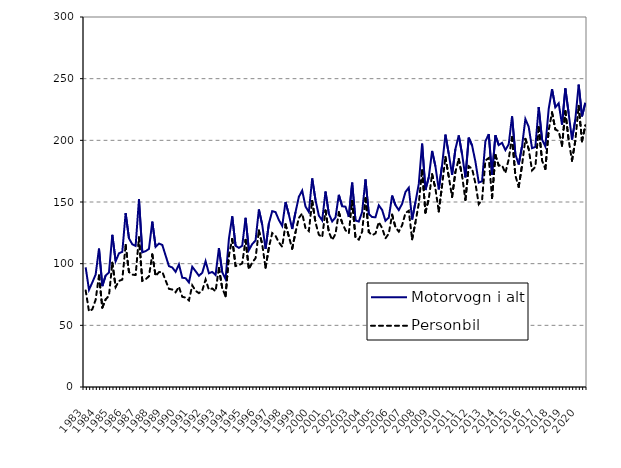
| Category | Motorvogn i alt | Personbil |
|---|---|---|
| 1983.0 | 97 | 78.3 |
| nan | 78.8 | 61.3 |
| nan | 84.8 | 63 |
| nan | 91.2 | 70.8 |
| 1984.0 | 112.2 | 90.4 |
| nan | 81.8 | 64.4 |
| nan | 90.4 | 71.1 |
| nan | 92.9 | 73.9 |
| 1985.0 | 123.4 | 100.8 |
| nan | 102 | 81.1 |
| nan | 108.4 | 86 |
| nan | 109.6 | 87.1 |
| 1986.0 | 141 | 115.2 |
| nan | 120.5 | 93.2 |
| nan | 115.7 | 91.1 |
| nan | 114.4 | 90.8 |
| 1987.0 | 152.2 | 121.3 |
| nan | 109.2 | 86.1 |
| nan | 110.1 | 87.3 |
| nan | 112 | 89.8 |
| 1988.0 | 134.1 | 107.5 |
| nan | 113.7 | 90 |
| nan | 116.3 | 93.1 |
| nan | 115.2 | 93.4 |
| 1989.0 | 106.6 | 86.4 |
| nan | 98 | 79.6 |
| nan | 96.9 | 79 |
| nan | 93.4 | 76.8 |
| 1990.0 | 99.4 | 81.3 |
| nan | 88.6 | 73.1 |
| nan | 88.2 | 72.5 |
| nan | 84.8 | 70.2 |
| 1991.0 | 97.5 | 82.4 |
| nan | 93.9 | 78 |
| nan | 90.2 | 76.1 |
| nan | 92.6 | 78.1 |
| 1992.0 | 102 | 87.1 |
| nan | 92.2 | 78.9 |
| nan | 93.3 | 79.9 |
| nan | 90.8 | 77.6 |
| 1993.0 | 112.6 | 96.5 |
| nan | 93 | 80.1 |
| nan | 87.5 | 73.6 |
| nan | 120.1 | 106.6 |
| 1994.0 | 138.4 | 120 |
| nan | 114.5 | 98.1 |
| nan | 112.8 | 98.8 |
| nan | 114.5 | 100.2 |
| 1995.0 | 137.2 | 119.3 |
| nan | 111 | 95.4 |
| nan | 115.9 | 101 |
| nan | 118.8 | 104.4 |
| 1996.0 | 143.9 | 126.9 |
| nan | 131.6 | 115.7 |
| nan | 112 | 96.7 |
| nan | 132.5 | 113.1 |
| 1997.0 | 142.6 | 124.8 |
| nan | 141.8 | 122.5 |
| nan | 135.4 | 117.3 |
| nan | 130.6 | 113.7 |
| 1998.0 | 150 | 131.9 |
| nan | 139.8 | 122 |
| nan | 128.1 | 112.1 |
| nan | 141.8 | 125.6 |
| 1999.0 | 154.2 | 137.1 |
| nan | 159.3 | 140.7 |
| nan | 146.3 | 128.7 |
| nan | 141.9 | 126.4 |
| 2000.0 | 169.1 | 150.9 |
| nan | 151.5 | 133.4 |
| nan | 139 | 123.5 |
| nan | 135.1 | 121.4 |
| 2001.0 | 158.5 | 143.1 |
| nan | 140.46 | 125.7 |
| nan | 134.24 | 119.2 |
| nan | 137.495 | 124.072 |
| 2002.0 | 155.814 | 141.724 |
| nan | 146.543 | 133.19 |
| nan | 146.231 | 127.141 |
| nan | 137.967 | 124.641 |
| 2003.0 | 165.679 | 150.811 |
| nan | 135.021 | 121.101 |
| nan | 134.111 | 119.491 |
| nan | 142.013 | 125.959 |
| 2004.0 | 168.309 | 153.043 |
| nan | 140.267 | 125.568 |
| nan | 137.77 | 123.121 |
| nan | 137.685 | 124.506 |
| 2005.0 | 147.311 | 133.756 |
| nan | 143.517 | 128.79 |
| nan | 134.783 | 120.571 |
| nan | 137.37 | 124.382 |
| 2006.0 | 155.213 | 139.728 |
| nan | 147.444 | 129.572 |
| nan | 143.451 | 126.006 |
| nan | 148.561 | 131.195 |
| 2007.0 | 158.1 | 141.084 |
| nan | 161.613 | 142.897 |
| nan | 135.821 | 119.753 |
| nan | 149.791 | 133.498 |
| 2008.0 | 164.642 | 148.614 |
| nan | 197.287 | 175.714 |
| nan | 159.718 | 141.407 |
| nan | 170.057 | 152.54 |
| 2009.0 | 191.38 | 172.559 |
| nan | 178.906 | 160.765 |
| nan | 160.234 | 142.312 |
| nan | 179.857 | 163.532 |
| 2010.0 | 204.636 | 186.507 |
| nan | 188.957 | 170.463 |
| nan | 172.077 | 154.156 |
| nan | 192.961 | 174.399 |
| 2011.0 | 204.005 | 184.86 |
| nan | 188.741 | 171.333 |
| nan | 169.934 | 151.694 |
| nan | 202.176 | 178.919 |
| 2012.0 | 195.829 | 177.072 |
| nan | 182.751 | 165.128 |
| nan | 165.73 | 148.242 |
| nan | 166.805 | 151.728 |
| 2013.0 | 199.181 | 183.653 |
| nan | 205.015 | 185.634 |
| nan | 172.044 | 153.21 |
| nan | 204.1 | 188.079 |
| 2014.0 | 196.177 | 179.552 |
| nan | 197.965 | 179.767 |
| nan | 192.105 | 173.474 |
| nan | 196.809 | 184.739 |
| 2015.0 | 219.419 | 202.592 |
| nan | 188.696 | 171.451 |
| nan | 180.388 | 162.297 |
| nan | 195.23 | 179.891 |
| 2016.0 | 217.298 | 201.197 |
| nan | 210.949 | 192.893 |
| nan | 193.648 | 175.642 |
| nan | 194.663 | 178.455 |
| 2017.0 | 227.029 | 210.738 |
| nan | 200.767 | 183.708 |
| nan | 195.059 | 176.766 |
| nan | 225.423 | 208.218 |
| 2018.0 | 241.528 | 222.678 |
| nan | 226.771 | 208.839 |
| nan | 230.044 | 207.395 |
| nan | 212.667 | 195.666 |
| 2019.0 | 242.056 | 223.584 |
| nan | 221.711 | 199.972 |
| nan | 200.668 | 183.518 |
| nan | 216.92 | 199.72 |
| 2020.0 | 245.163 | 227.947 |
| nan | 219.434 | 199.239 |
| nan | 230.409 | 212.039 |